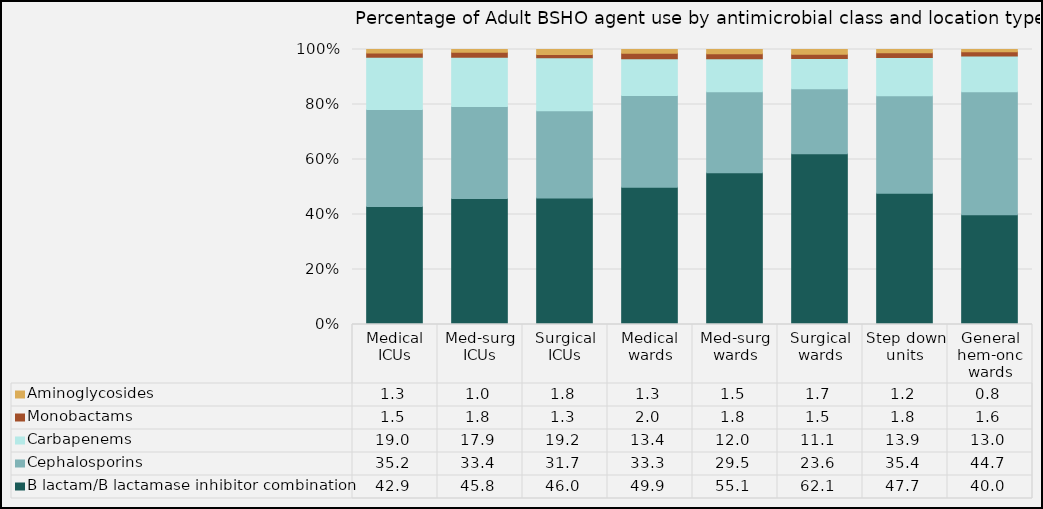
| Category | B lactam/B lactamase inhibitor combination | Cephalosporins | Carbapenems | Monobactams | Aminoglycosides |
|---|---|---|---|---|---|
| Medical ICUs | 42.94 | 35.22 | 19.04 | 1.5 | 1.3 |
| Med-surg ICUs | 45.84 | 33.41 | 17.9 | 1.82 | 1.03 |
| Surgical ICUs | 46.01 | 31.74 | 19.22 | 1.25 | 1.78 |
| Medical wards | 49.92 | 33.34 | 13.38 | 2.04 | 1.33 |
| Med-surg wards | 55.14 | 29.49 | 12 | 1.84 | 1.53 |
| Surgical wards | 62.1 | 23.61 | 11.06 | 1.54 | 1.69 |
| Step down units | 47.73 | 35.43 | 13.89 | 1.77 | 1.17 |
| General hem-onc wards | 39.95 | 44.67 | 12.97 | 1.59 | 0.81 |